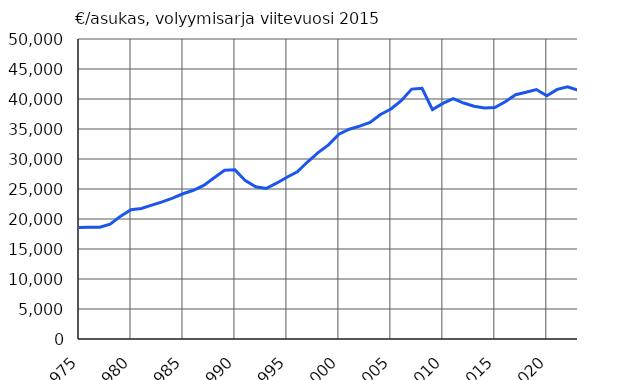
| Category |  €/asukas, volyymisarja viitevuosi 2015 |
|---|---|
| 1975 | 18576 |
| 1976 | 18613 |
| 1977 | 18621 |
| 1978 | 19152 |
| 1979 | 20475 |
| 1980 | 21561 |
| 1981 | 21751 |
| 1982 | 22302 |
| 1983 | 22860 |
| 1984 | 23475 |
| 1985 | 24207 |
| 1986 | 24793 |
| 1987 | 25607 |
| 1988 | 26864 |
| 1989 | 28129 |
| 1990 | 28193 |
| 1991 | 26389 |
| 1992 | 25376 |
| 1993 | 25087 |
| 1994 | 25969 |
| 1995 | 26961 |
| 1996 | 27858 |
| 1997 | 29535 |
| 1998 | 31064 |
| 1999 | 32349 |
| 2000 | 34145 |
| 2001 | 34957 |
| 2002 | 35468 |
| 2003 | 36092 |
| 2004 | 37424 |
| 2005 | 38333 |
| 2006 | 39724 |
| 2007 | 41652 |
| 2008 | 41783 |
| 2009 | 38226 |
| 2010 | 39263 |
| 2011 | 40078 |
| 2012 | 39330 |
| 2013 | 38796 |
| 2014 | 38488 |
| 2015 | 38570 |
| 2016 | 39548 |
| 2017 | 40715 |
| 2018 | 41119 |
| 2019 | 41582 |
| 2020 | 40536 |
| 2021 | 41605 |
| 2022* | 42044 |
| 2023* | 41456 |